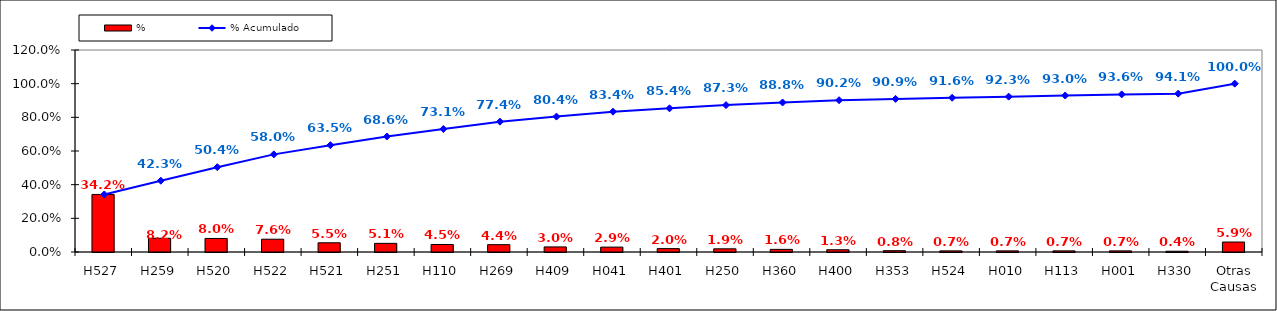
| Category | % |
|---|---|
| H527 | 0.342 |
| H259 | 0.082 |
| H520 | 0.08 |
| H522 | 0.076 |
| H521 | 0.055 |
| H251 | 0.051 |
| H110 | 0.045 |
| H269 | 0.044 |
| H409 | 0.03 |
| H041 | 0.029 |
| H401 | 0.02 |
| H250 | 0.019 |
| H360 | 0.016 |
| H400 | 0.013 |
| H353 | 0.008 |
| H524 | 0.007 |
| H010 | 0.007 |
| H113 | 0.007 |
| H001 | 0.007 |
| H330 | 0.004 |
| Otras Causas | 0.059 |